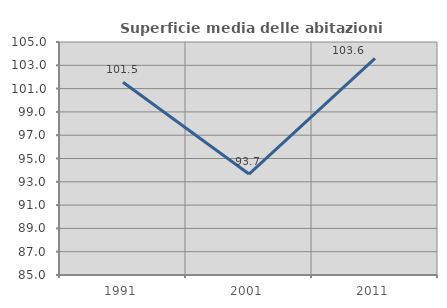
| Category | Superficie media delle abitazioni occupate |
|---|---|
| 1991.0 | 101.541 |
| 2001.0 | 93.664 |
| 2011.0 | 103.602 |